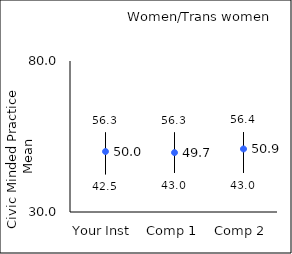
| Category | 25th percentile | 75th percentile | Mean |
|---|---|---|---|
| Your Inst | 42.5 | 56.3 | 50.03 |
| Comp 1 | 43 | 56.3 | 49.67 |
| Comp 2 | 43 | 56.4 | 50.88 |